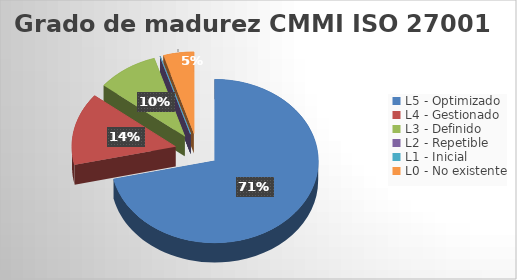
| Category | Series 0 |
|---|---|
| L5 - Optimizado | 0.714 |
| L4 - Gestionado | 0.143 |
| L3 - Definido | 0.095 |
| L2 - Repetible | 0 |
| L1 - Inicial | 0 |
| L0 - No existente | 0.048 |